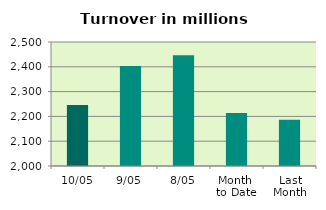
| Category | Series 0 |
|---|---|
| 10/05 | 2246.072 |
| 9/05 | 2403.105 |
| 8/05 | 2446.843 |
| Month 
to Date | 2213.36 |
| Last
Month | 2186.926 |